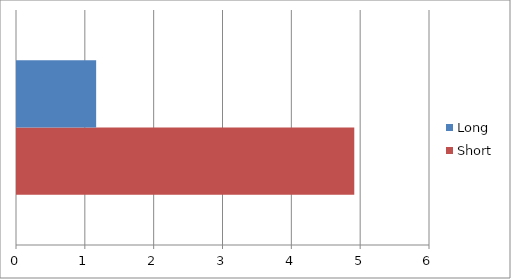
| Category | Short | Long |
|---|---|---|
| 0 | 4.9 | 1.15 |